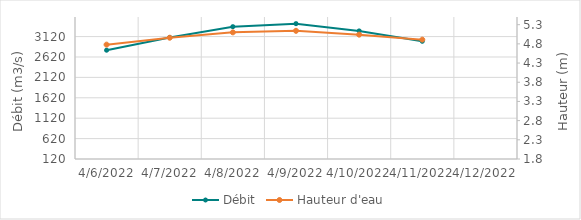
| Category | Débit |
|---|---|
| 2/23/22 | 1581.85 |
| 2/22/22 | 1735.76 |
| 2/21/22 | 1825 |
| 2/20/22 | 1907.4 |
| 2/19/22 | 1919.8 |
| 2/18/22 | 1795.67 |
| 2/17/22 | 1726.25 |